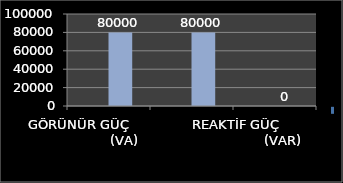
| Category | Series 0 | Series 1 |
|---|---|---|
| GÖRÜNÜR GÜÇ                       (VA) |  | 80000 |
| AKTİF GÜÇ                           (W) |  | 80000 |
| REAKTİF GÜÇ                       (VAR) |  | 0 |